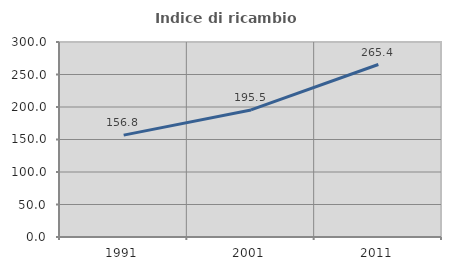
| Category | Indice di ricambio occupazionale  |
|---|---|
| 1991.0 | 156.757 |
| 2001.0 | 195.455 |
| 2011.0 | 265.385 |